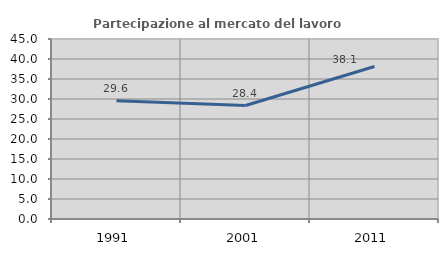
| Category | Partecipazione al mercato del lavoro  femminile |
|---|---|
| 1991.0 | 29.554 |
| 2001.0 | 28.366 |
| 2011.0 | 38.128 |